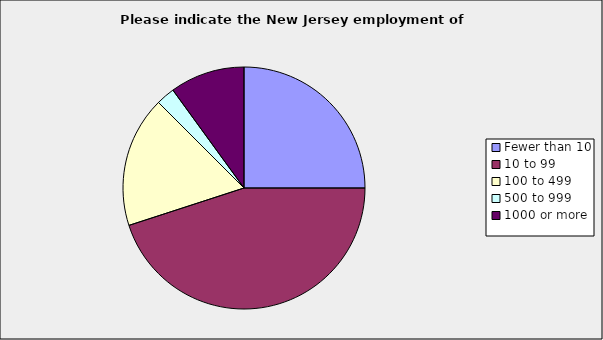
| Category | Series 0 |
|---|---|
| Fewer than 10 | 0.25 |
| 10 to 99 | 0.45 |
| 100 to 499 | 0.175 |
| 500 to 999 | 0.025 |
| 1000 or more | 0.1 |